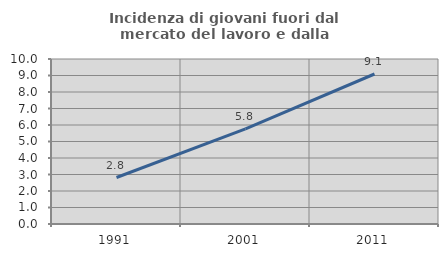
| Category | Incidenza di giovani fuori dal mercato del lavoro e dalla formazione  |
|---|---|
| 1991.0 | 2.817 |
| 2001.0 | 5.769 |
| 2011.0 | 9.091 |